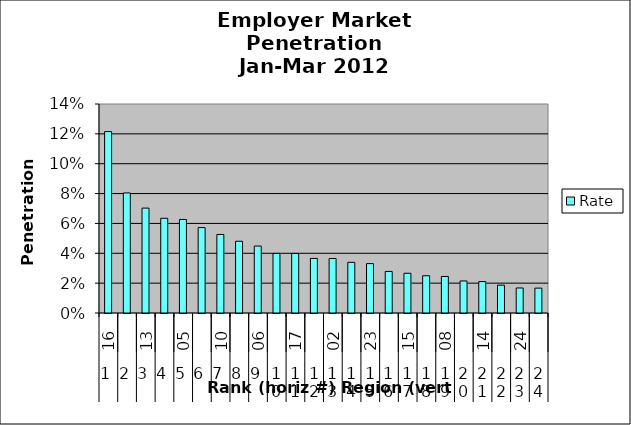
| Category | Rate |
|---|---|
| 0 | 0.122 |
| 1 | 0.08 |
| 2 | 0.07 |
| 3 | 0.063 |
| 4 | 0.063 |
| 5 | 0.057 |
| 6 | 0.053 |
| 7 | 0.048 |
| 8 | 0.045 |
| 9 | 0.04 |
| 10 | 0.04 |
| 11 | 0.037 |
| 12 | 0.037 |
| 13 | 0.034 |
| 14 | 0.033 |
| 15 | 0.028 |
| 16 | 0.027 |
| 17 | 0.025 |
| 18 | 0.024 |
| 19 | 0.021 |
| 20 | 0.021 |
| 21 | 0.019 |
| 22 | 0.017 |
| 23 | 0.017 |